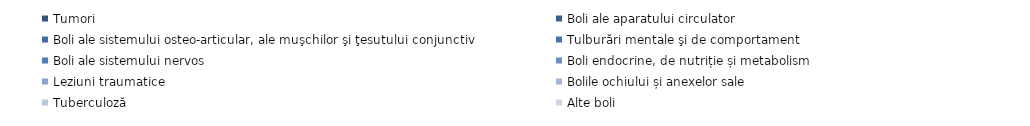
| Category | Urban |
|---|---|
| Tumori  | 19.8 |
| Boli ale aparatului circulator | 16.4 |
| Boli ale sistemului osteo-articular, ale muşchilor şi ţesutului conjunctiv | 12.7 |
| Tulburări mentale şi de comportament | 11.1 |
| Boli ale sistemului nervos | 8.2 |
| Boli endocrine, de nutriție și metabolism | 7.1 |
| Leziuni traumatice  | 5.2 |
| Bolile ochiului și anexelor sale | 3.5 |
| Tuberculoză | 2.4 |
| Alte boli | 13.6 |